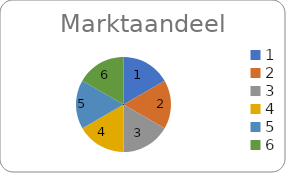
| Category | Series 0 |
|---|---|
| 1.0 | 0.167 |
| 2.0 | 0.167 |
| 3.0 | 0.167 |
| 4.0 | 0.167 |
| 5.0 | 0.167 |
| 6.0 | 0.167 |